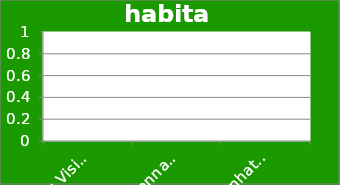
| Category | habitat |
|---|---|
| 0's Vision | 0 |
| Mannahatta (1609) | 0 |
| Manhattan (2010) | 0 |